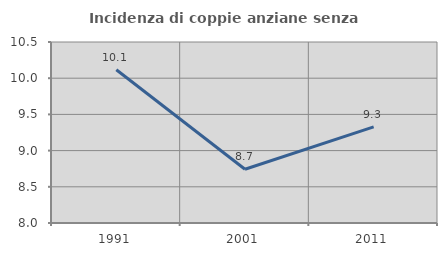
| Category | Incidenza di coppie anziane senza figli  |
|---|---|
| 1991.0 | 10.116 |
| 2001.0 | 8.742 |
| 2011.0 | 9.328 |